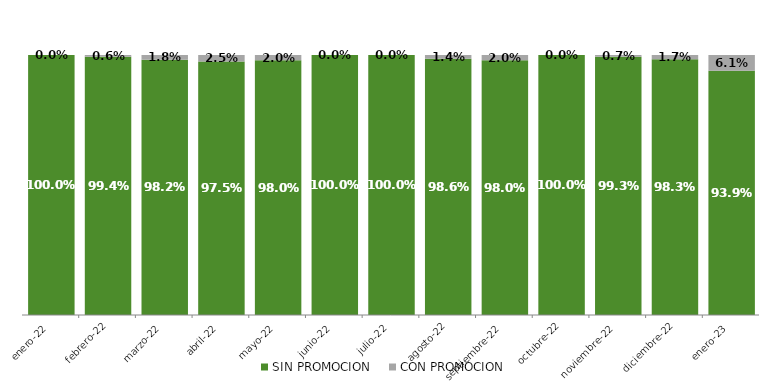
| Category | SIN PROMOCION   | CON PROMOCION   |
|---|---|---|
| 2022-01-01 | 1 | 0 |
| 2022-02-01 | 0.994 | 0.006 |
| 2022-03-01 | 0.982 | 0.018 |
| 2022-04-01 | 0.975 | 0.025 |
| 2022-05-01 | 0.98 | 0.02 |
| 2022-06-01 | 1 | 0 |
| 2022-07-01 | 1 | 0 |
| 2022-08-01 | 0.986 | 0.014 |
| 2022-09-01 | 0.98 | 0.02 |
| 2022-10-01 | 1 | 0 |
| 2022-11-01 | 0.993 | 0.007 |
| 2022-12-01 | 0.983 | 0.017 |
| 2023-01-01 | 0.939 | 0.061 |